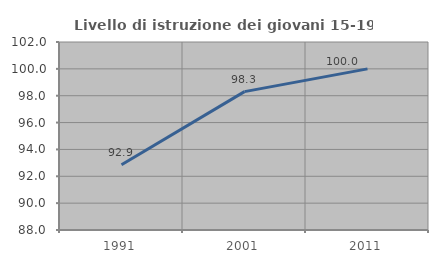
| Category | Livello di istruzione dei giovani 15-19 anni |
|---|---|
| 1991.0 | 92.857 |
| 2001.0 | 98.305 |
| 2011.0 | 100 |